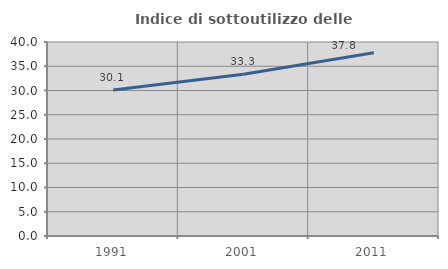
| Category | Indice di sottoutilizzo delle abitazioni  |
|---|---|
| 1991.0 | 30.108 |
| 2001.0 | 33.333 |
| 2011.0 | 37.771 |